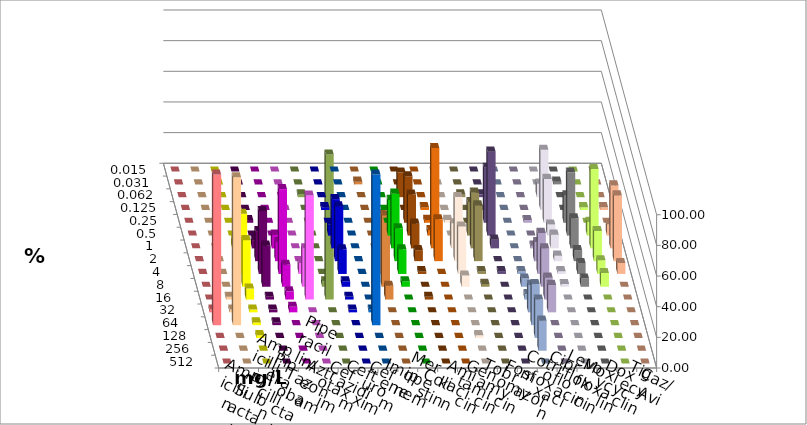
| Category | Ampicillin | Ampicillin/ Sulbactam | Piperacillin | Piperacillin/ Tazobactam | Aztreonam | Cefotaxim | Ceftazidim | Cefuroxim | Imipenem | Meropenem | Colistin | Amikacin | Gentamicin | Tobramycin | Fosfomycin | Cotrimoxazol | Ciprofloxacin | Levofloxacin | Moxifloxacin | Doxycyclin | Tigecyclin | Caz/Avi |
|---|---|---|---|---|---|---|---|---|---|---|---|---|---|---|---|---|---|---|---|---|---|---|
| 0.015 | 0 | 0 | 0 | 0 | 0 | 0 | 0 | 0 | 0 | 0 | 0 | 0 | 0 | 0 | 0 | 0 | 0 | 0 | 0 | 0 | 0 | 0 |
| 0.031 | 0 | 0 | 0 | 0 | 0 | 0 | 0 | 0 | 0 | 0 | 0 | 0 | 0 | 0 | 0 | 0 | 0 | 1.786 | 0 | 0 | 1.786 | 0 |
| 0.062 | 0 | 0 | 0 | 0 | 0 | 0 | 0 | 0 | 0 | 16.071 | 0 | 0 | 1.818 | 1.887 | 0 | 0 | 8.929 | 0 | 0 | 1.786 | 0 | 0 |
| 0.125 | 0 | 0 | 0 | 0 | 0 | 0 | 1.786 | 0 | 0 | 0 | 1.818 | 0 | 0 | 0 | 0 | 0 | 39.286 | 0 | 1.786 | 0 | 0 | 1.786 |
| 0.25 | 0 | 0 | 0 | 1.786 | 0 | 0 | 0 | 0 | 0 | 30.357 | 1.818 | 1.818 | 0 | 35.849 | 0 | 1.786 | 28.571 | 17.857 | 0 | 0 | 0 | 0 |
| 0.5 | 0 | 0 | 0 | 0 | 0 | 0 | 7.143 | 0 | 23.214 | 26.786 | 3.636 | 0 | 21.818 | 54.717 | 0 | 0 | 7.143 | 41.071 | 8.929 | 0 | 0 | 7.143 |
| 1.0 | 0 | 0 | 5.357 | 5.357 | 8.929 | 0 | 32.143 | 0 | 35.714 | 16.071 | 65.455 | 16.364 | 36.364 | 5.66 | 0 | 1.786 | 8.929 | 19.643 | 51.786 | 0 | 0 | 41.071 |
| 2.0 | 0 | 0 | 12.5 | 19.643 | 12.5 | 0 | 35.714 | 0 | 21.429 | 7.143 | 27.273 | 41.818 | 36.364 | 0 | 0 | 12.5 | 3.571 | 7.143 | 19.643 | 0 | 3.571 | 42.857 |
| 4.0 | 0 | 0 | 39.286 | 41.071 | 55.357 | 7.143 | 16.071 | 0 | 16.071 | 1.786 | 0 | 30.909 | 1.818 | 1.887 | 1.786 | 26.786 | 1.786 | 7.143 | 8.929 | 0 | 39.286 | 7.143 |
| 8.0 | 0 | 0 | 30.357 | 26.786 | 14.286 | 25 | 3.571 | 0 | 3.571 | 0 | 0 | 7.273 | 1.818 | 0 | 5.357 | 25 | 1.786 | 5.357 | 8.929 | 3.571 | 46.429 | 0 |
| 16.0 | 0 | 1.786 | 7.143 | 1.786 | 5.357 | 67.857 | 1.786 | 0 | 0 | 1.786 | 0 | 0 | 0 | 0 | 3.571 | 14.286 | 0 | 0 | 0 | 94.643 | 8.929 | 0 |
| 32.0 | 1.786 | 1.786 | 1.786 | 1.786 | 3.571 | 0 | 1.786 | 1.786 | 0 | 0 | 0 | 0 | 0 | 0 | 17.857 | 17.857 | 0 | 0 | 0 | 0 | 0 | 0 |
| 64.0 | 98.214 | 96.429 | 1.786 | 1.786 | 0 | 0 | 0 | 98.214 | 0 | 0 | 0 | 0 | 0 | 0 | 26.786 | 0 | 0 | 0 | 0 | 0 | 0 | 0 |
| 128.0 | 0 | 0 | 1.786 | 0 | 0 | 0 | 0 | 0 | 0 | 0 | 0 | 1.818 | 0 | 0 | 25 | 0 | 0 | 0 | 0 | 0 | 0 | 0 |
| 256.0 | 0 | 0 | 0 | 0 | 0 | 0 | 0 | 0 | 0 | 0 | 0 | 0 | 0 | 0 | 19.643 | 0 | 0 | 0 | 0 | 0 | 0 | 0 |
| 512.0 | 0 | 0 | 0 | 0 | 0 | 0 | 0 | 0 | 0 | 0 | 0 | 0 | 0 | 0 | 0 | 0 | 0 | 0 | 0 | 0 | 0 | 0 |